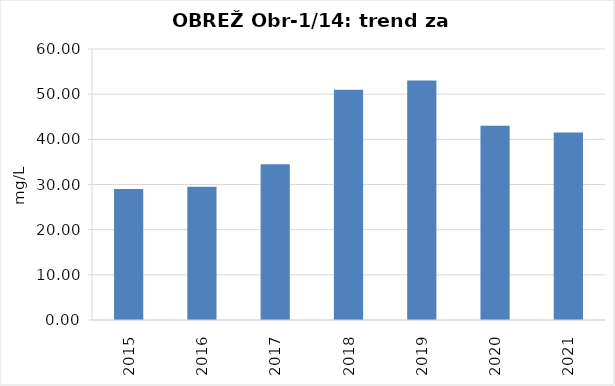
| Category | Vsota |
|---|---|
| 2015 | 29 |
| 2016 | 29.5 |
| 2017 | 34.5 |
| 2018 | 51 |
| 2019 | 53 |
| 2020 | 43 |
| 2021 | 41.5 |